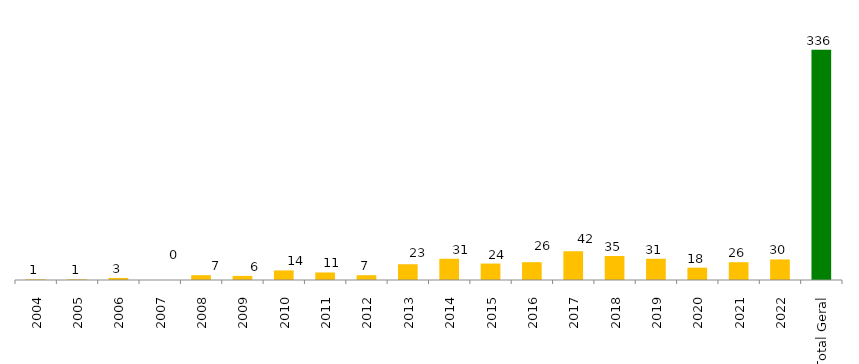
| Category | Categoria/Ano |
|---|---|
| 2004 | 1 |
| 2005 | 1 |
| 2006 | 3 |
| 2007 | 0 |
| 2008 | 7 |
| 2009 | 6 |
| 2010 | 14 |
| 2011 | 11 |
| 2012 | 7 |
| 2013 | 23 |
| 2014 | 31 |
| 2015 | 24 |
| 2016 | 26 |
| 2017 | 42 |
| 2018 | 35 |
| 2019 | 31 |
| 2020 | 18 |
| 2021 | 26 |
| 2022 | 30 |
| Total Geral | 336 |